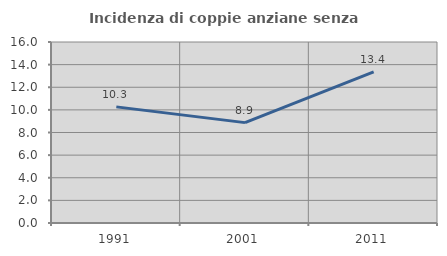
| Category | Incidenza di coppie anziane senza figli  |
|---|---|
| 1991.0 | 10.266 |
| 2001.0 | 8.874 |
| 2011.0 | 13.354 |